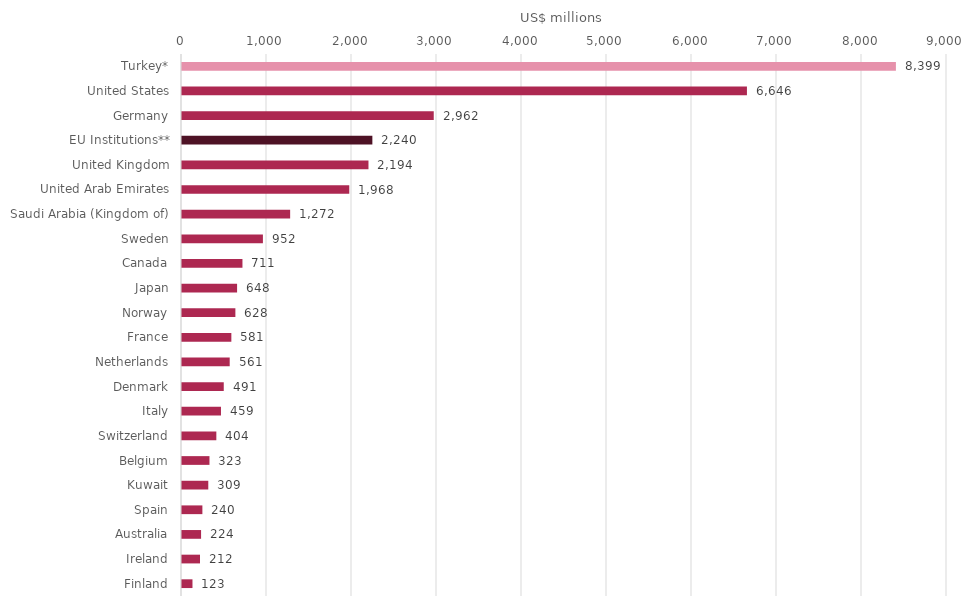
| Category | 2018 |
|---|---|
| Turkey* | 8398.902 |
| United States | 6646.361 |
| Germany | 2961.808 |
| EU Institutions** | 2239.548 |
| United Kingdom | 2193.814 |
| United Arab Emirates | 1967.843 |
| Saudi Arabia (Kingdom of) | 1272.307 |
| Sweden | 951.856 |
| Canada | 711.241 |
| Japan | 648.029 |
| Norway | 628.019 |
| France | 580.612 |
| Netherlands | 561.251 |
| Denmark | 491.244 |
| Italy | 458.55 |
| Switzerland | 403.989 |
| Belgium | 323.249 |
| Kuwait | 309.237 |
| Spain | 239.822 |
| Australia | 224.434 |
| Ireland | 211.866 |
| Finland | 123.23 |